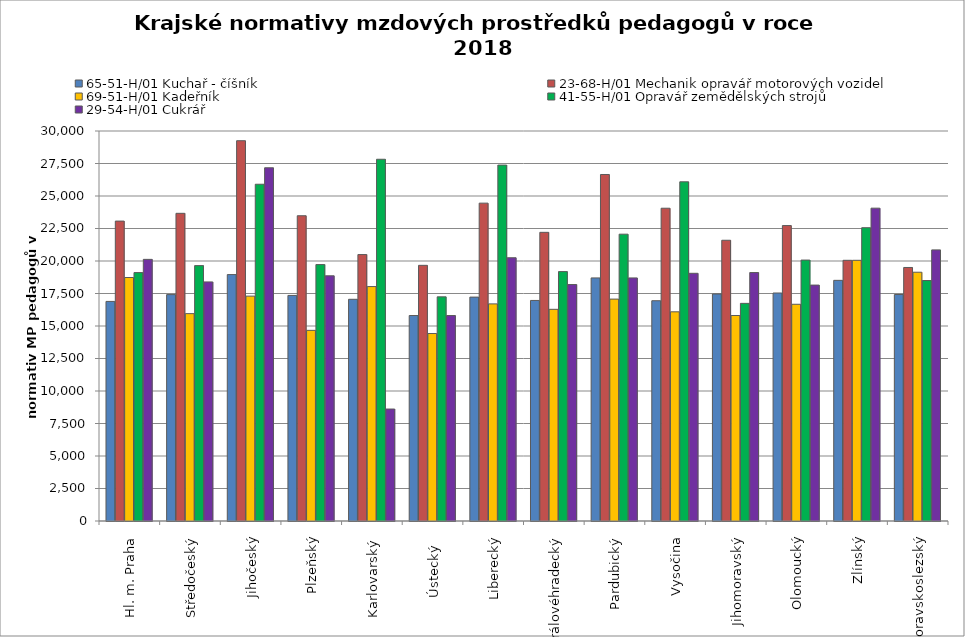
| Category | 65-51-H/01 Kuchař - číšník | 23-68-H/01 Mechanik opravář motorových vozidel | 69-51-H/01 Kadeřník | 41-55-H/01 Opravář zemědělských strojů | 29-54-H/01 Cukrář |
|---|---|---|---|---|---|
| Hl. m. Praha | 16891.071 | 23070.732 | 18730.693 | 19109.091 | 20125.532 |
| Středočeský | 17414.671 | 23667.864 | 15950.885 | 19645.137 | 18391.192 |
| Jihočeský | 18954.503 | 29253.313 | 17297.611 | 25904.921 | 27171.301 |
| Plzeňský | 17351.99 | 23481.657 | 14665.188 | 19723.658 | 18861.217 |
| Karlovarský  | 17054.698 | 20494.382 | 18032.625 | 27826.087 | 8611.898 |
| Ústecký   | 15804.539 | 19666.859 | 14421.809 | 17242.041 | 15804.539 |
| Liberecký | 17223.504 | 24450.58 | 16701.177 | 27378.763 | 20251.198 |
| Královéhradecký | 16965.346 | 22204.343 | 16282.53 | 19184.367 | 18189.13 |
| Pardubický | 18699.517 | 26654.323 | 17068.692 | 22062.825 | 18699.517 |
| Vysočina | 16943.914 | 24059.629 | 16090.174 | 26092.048 | 19053.231 |
| Jihomoravský | 17462.956 | 21595.287 | 15807.003 | 16741.221 | 19112.373 |
| Olomoucký | 17537.511 | 22725.522 | 16671.83 | 20071.107 | 18146.735 |
| Zlínský | 18511.385 | 20054 | 20054 | 22560.75 | 24064.8 |
| Moravskoslezský | 17420.423 | 19501.545 | 19136.938 | 18497.688 | 20854.626 |